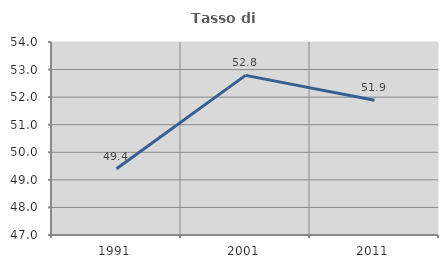
| Category | Tasso di occupazione   |
|---|---|
| 1991.0 | 49.404 |
| 2001.0 | 52.79 |
| 2011.0 | 51.884 |